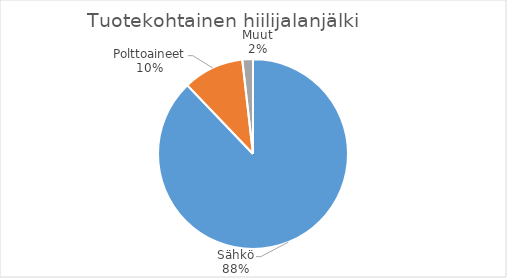
| Category | Series 0 |
|---|---|
| Sähkö | 16.436 |
| Polttoaineet | 1.934 |
| Muut | 0.338 |
| Ruoka | 0 |